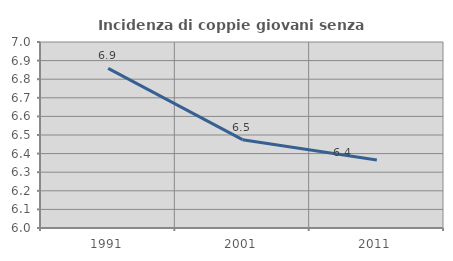
| Category | Incidenza di coppie giovani senza figli |
|---|---|
| 1991.0 | 6.858 |
| 2001.0 | 6.475 |
| 2011.0 | 6.366 |